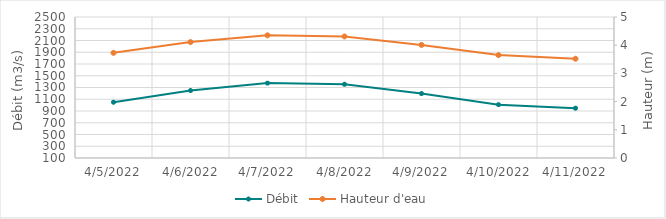
| Category | Débit |
|---|---|
| 2/23/22 | 429.83 |
| 2/22/22 | 461.67 |
| 2/21/22 | 513.39 |
| 2/20/22 | 590.14 |
| 2/19/22 | 638.26 |
| 2/18/22 | 615.14 |
| 2/17/22 | 610.53 |